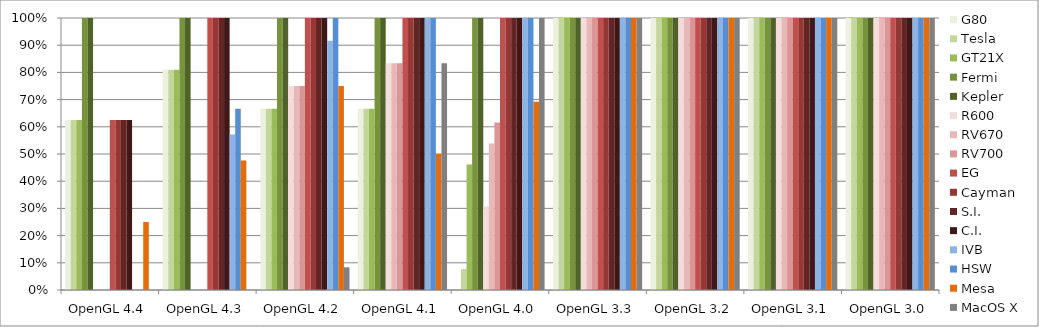
| Category | G80 | Tesla | GT21X | Fermi | Kepler | R600 | RV670 | RV700 | EG | Cayman | S.I. | C.I. | IVB | HSW | Mesa | MacOS X |
|---|---|---|---|---|---|---|---|---|---|---|---|---|---|---|---|---|
| OpenGL 4.4 | 0.625 | 0.625 | 0.625 | 1 | 1 | 0 | 0 | 0 | 0.625 | 0.625 | 0.625 | 0.625 | 0 | 0 | 0.25 | 0 |
| OpenGL 4.3 | 0.81 | 0.81 | 0.81 | 1 | 1 | 0 | 0 | 0 | 1 | 1 | 1 | 1 | 0.571 | 0.667 | 0.476 | 0 |
| OpenGL 4.2 | 0.667 | 0.667 | 0.667 | 1 | 1 | 0.75 | 0.75 | 0.75 | 1 | 1 | 1 | 1 | 0.917 | 1 | 0.75 | 0.083 |
| OpenGL 4.1 | 0.667 | 0.667 | 0.667 | 1 | 1 | 0.833 | 0.833 | 0.833 | 1 | 1 | 1 | 1 | 1 | 1 | 0.5 | 0.833 |
| OpenGL 4.0 | 0 | 0.077 | 0.462 | 1 | 1 | 0.308 | 0.538 | 0.615 | 1 | 1 | 1 | 1 | 1 | 1 | 0.692 | 1 |
| OpenGL 3.3 | 1 | 1 | 1 | 1 | 1 | 1 | 1 | 1 | 1 | 1 | 1 | 1 | 1 | 1 | 1 | 1 |
| OpenGL 3.2 | 1 | 1 | 1 | 1 | 1 | 1 | 1 | 1 | 1 | 1 | 1 | 1 | 1 | 1 | 1 | 1 |
| OpenGL 3.1 | 1 | 1 | 1 | 1 | 1 | 1 | 1 | 1 | 1 | 1 | 1 | 1 | 1 | 1 | 1 | 1 |
| OpenGL 3.0 | 1 | 1 | 1 | 1 | 1 | 1 | 1 | 1 | 1 | 1 | 1 | 1 | 1 | 1 | 1 | 1 |